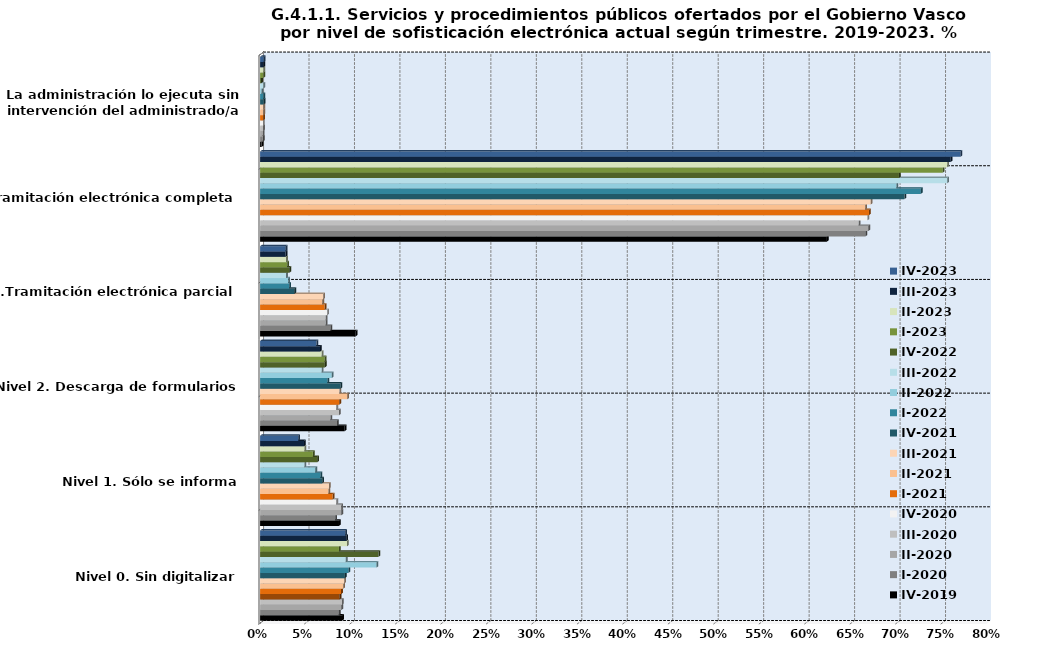
| Category | IV-2019 | I-2020 | II-2020 | III-2020 | IV-2020 | I-2021 | II-2021 | III-2021 | IV-2021 | I-2022 | II-2022 | III-2022 | IV-2022 | I-2023 | II-2023 | III-2023 | IV-2023 |
|---|---|---|---|---|---|---|---|---|---|---|---|---|---|---|---|---|---|
| Nivel 0. Sin digitalizar | 0.09 | 0.087 | 0.089 | 0.09 | 0.087 | 0.089 | 0.091 | 0.093 | 0.093 | 0.097 | 0.128 | 0.094 | 0.13 | 0.087 | 0.096 | 0.095 | 0.094 |
| Nivel 1. Sólo se informa | 0.087 | 0.083 | 0.089 | 0.089 | 0.084 | 0.08 | 0.075 | 0.076 | 0.068 | 0.066 | 0.061 | 0.049 | 0.063 | 0.058 | 0.049 | 0.048 | 0.042 |
| Nivel 2. Descarga de formularios | 0.093 | 0.085 | 0.077 | 0.087 | 0.084 | 0.087 | 0.096 | 0.087 | 0.088 | 0.074 | 0.079 | 0.068 | 0.071 | 0.071 | 0.068 | 0.066 | 0.062 |
| Nivel 3.Tramitación electrónica parcial | 0.105 | 0.077 | 0.072 | 0.072 | 0.074 | 0.071 | 0.068 | 0.069 | 0.038 | 0.032 | 0.031 | 0.029 | 0.032 | 0.03 | 0.029 | 0.028 | 0.028 |
| Nivel 4 Tramitación electrónica completa | 0.623 | 0.666 | 0.669 | 0.658 | 0.668 | 0.67 | 0.665 | 0.672 | 0.709 | 0.727 | 0.7 | 0.756 | 0.703 | 0.751 | 0.756 | 0.759 | 0.77 |
| Nivel 5. La administración lo ejecuta sin intervención del administrado/a | 0.002 | 0.003 | 0.003 | 0.003 | 0.003 | 0.003 | 0.004 | 0.004 | 0.004 | 0.004 | 0.002 | 0.004 | 0.001 | 0.004 | 0.004 | 0.004 | 0.004 |